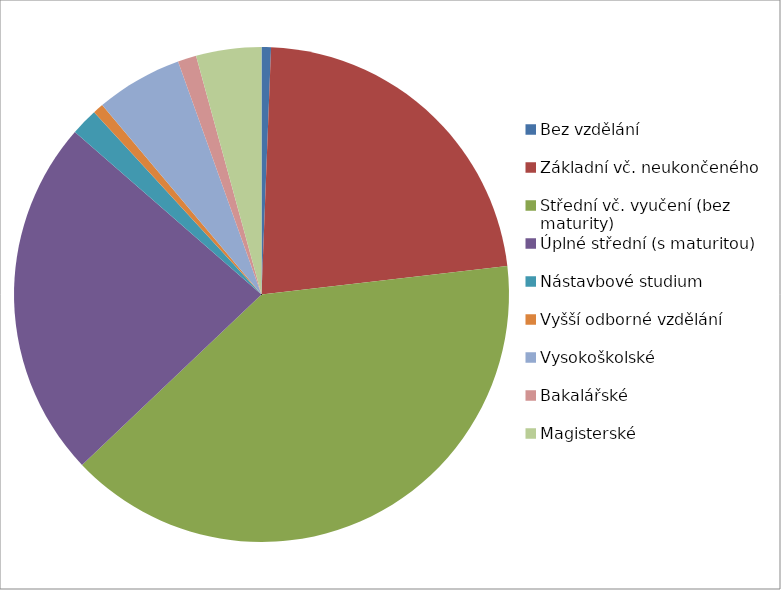
| Category | Series 0 |
|---|---|
| Bez vzdělání | 0.005 |
| Základní vč. neukončeného | 0.19 |
| Střední vč. vyučení (bez maturity)  | 0.336 |
| Úplné střední (s maturitou) | 0.198 |
| Nástavbové studium | 0.015 |
| Vyšší odborné vzdělání | 0.006 |
| Vysokoškolské | 0.048 |
| Bakalářské | 0.01 |
| Magisterské | 0.036 |